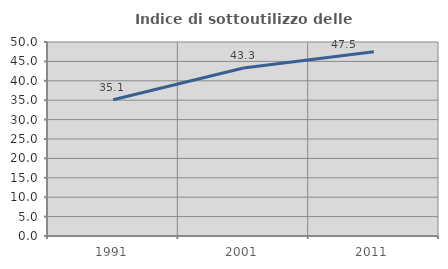
| Category | Indice di sottoutilizzo delle abitazioni  |
|---|---|
| 1991.0 | 35.124 |
| 2001.0 | 43.295 |
| 2011.0 | 47.49 |